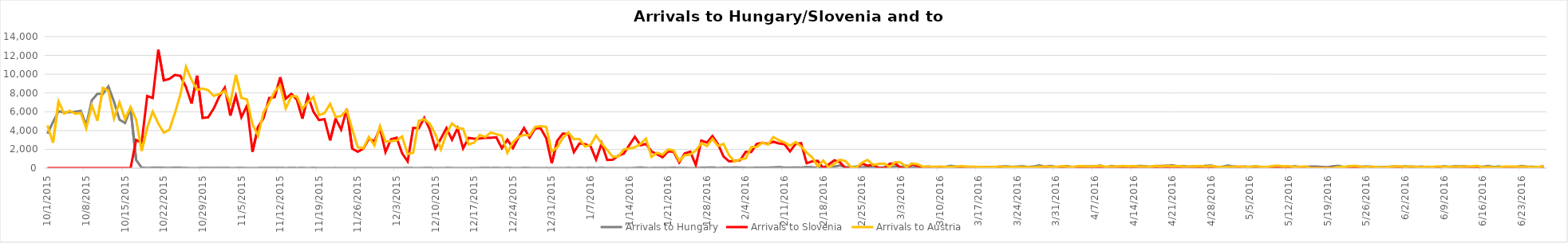
| Category | Arrivals to Hungary | Arrivals to Slovenia | Arrivals to Austria |
|---|---|---|---|
| 10/1/15 | 3667 | 0 | 4550 |
| 10/2/15 | 4897 | 0 | 2700 |
| 10/3/15 | 6056 | 0 | 7100 |
| 10/4/15 | 5925 | 0 | 5800 |
| 10/5/15 | 5952 | 0 | 6100 |
| 10/6/15 | 6000 | 0 | 5800 |
| 10/7/15 | 6103 | 0 | 5861 |
| 10/8/15 | 4583 | 6 | 4229 |
| 10/9/15 | 7215 | 0 | 6700 |
| 10/10/15 | 7907 | 0 | 5050 |
| 10/11/15 | 7897 | 0 | 8540 |
| 10/12/15 | 8702 | 0 | 8240 |
| 10/13/15 | 7081 | 0 | 5280 |
| 10/14/15 | 5157 | 0 | 7000 |
| 10/15/15 | 4808 | 0 | 5235 |
| 10/16/15 | 6353 | 0 | 6500 |
| 10/17/15 | 870 | 3000 | 5155 |
| 10/18/15 | 41 | 2700 | 1822 |
| 10/19/15 | 22 | 7677 | 4300 |
| 10/20/15 | 36 | 7478 | 6017 |
| 10/21/15 | 39 | 12616 | 4737 |
| 10/22/15 | 32 | 9339 | 3767 |
| 10/23/15 | 29 | 9500 | 4092 |
| 10/24/15 | 35 | 9925 | 5841 |
| 10/25/15 | 34 | 9818 | 7882 |
| 10/26/15 | 12 | 8625 | 10784 |
| 10/27/15 | 7 | 6877 | 9390 |
| 10/28/15 | 4 | 9848 | 8336 |
| 10/29/15 | 23 | 5341 | 8473 |
| 10/30/15 | 18 | 5409 | 8302 |
| 10/31/15 | 10 | 6344 | 7691 |
| 11/1/15 | 14 | 7611 | 7887 |
| 11/2/15 | 31 | 8568 | 8243 |
| 11/3/15 | 8 | 5591 | 6900 |
| 11/4/15 | 10 | 7693 | 9930 |
| 11/5/15 | 18 | 5426 | 7478 |
| 11/6/15 | 4 | 6655 | 7315 |
| 11/7/15 | 8 | 1716 | 4648 |
| 11/8/15 | 9 | 4381 | 3465 |
| 11/9/15 | 25 | 5341 | 5962 |
| 11/10/15 | 14 | 7457 | 6933 |
| 11/11/15 | 13 | 7554 | 8169 |
| 11/12/15 | 23 | 9681 | 8777 |
| 11/13/15 | 6 | 7397 | 6351 |
| 11/14/15 | 21 | 7905 | 7659 |
| 11/15/15 | 8 | 7300 | 7632 |
| 11/16/15 | 15 | 5261 | 6319 |
| 11/17/15 | 5 | 7704 | 7026 |
| 11/18/15 | 15 | 5998 | 7577 |
| 11/19/15 | 4 | 5119 | 5635 |
| 11/20/15 | 9 | 5211 | 5865 |
| 11/21/15 | 2 | 2952 | 6836 |
| 11/22/15 | 11 | 5260 | 5446 |
| 11/23/15 | 4 | 4102 | 5546 |
| 11/24/15 | 4 | 6297 | 6204 |
| 11/25/15 | 6 | 2070 | 4122 |
| 11/26/15 | 10 | 1742 | 2211 |
| 11/27/15 | 2 | 2065 | 2120 |
| 11/28/15 | 6 | 3139 | 3320 |
| 11/29/15 | 3 | 2843 | 2407 |
| 11/30/15 | 7 | 4274 | 4482 |
| 12/1/15 | 4 | 1709 | 2821 |
| 12/2/15 | 4 | 3077 | 2874 |
| 12/3/15 | 9 | 3237 | 2935 |
| 12/4/15 | 1 | 1577 | 3366 |
| 12/5/15 | 31 | 715 | 1493 |
| 12/6/15 | 7 | 4288 | 1643 |
| 12/7/15 | 0 | 4240 | 5035 |
| 12/8/15 | 13 | 5351 | 5210 |
| 12/9/15 | 14 | 4103 | 4714 |
| 12/10/15 | 3 | 2078 | 3623 |
| 12/11/15 | 0 | 3149 | 2000 |
| 12/12/15 | 13 | 4271 | 3675 |
| 12/13/15 | 10 | 3016 | 4754 |
| 12/14/15 | 3 | 4250 | 4263 |
| 12/15/15 | 2 | 2098 | 4193 |
| 12/16/15 | 6 | 3214 | 2519 |
| 12/17/15 | 0 | 3135 | 2717 |
| 12/18/15 | 11 | 3150 | 3532 |
| 12/19/15 | 31 | 3222 | 3305 |
| 12/20/15 | 8 | 3233 | 3800 |
| 12/21/15 | 25 | 3278 | 3611 |
| 12/22/15 | 1 | 2118 | 3451 |
| 12/23/15 | 21 | 3030 | 1613 |
| 12/24/15 | 8 | 2131 | 2764 |
| 12/25/15 | 2 | 3257 | 3321 |
| 12/26/15 | 17 | 4274 | 3532 |
| 12/27/15 | 10 | 3253 | 3476 |
| 12/28/15 | 0 | 4228 | 4394 |
| 12/29/15 | 0 | 4239 | 4468 |
| 12/30/15 | 11 | 3195 | 4386 |
| 12/31/15 | 5 | 511 | 1756 |
| 1/1/16 | 0 | 2914 | 2226 |
| 1/2/16 | 0 | 3690 | 3199 |
| 1/3/16 | 17 | 3619 | 3793 |
| 1/4/16 | 3 | 1708 | 3085 |
| 1/5/16 | 18 | 2626 | 3091 |
| 1/6/16 | 5 | 2550 | 2299 |
| 1/7/16 | 31 | 2337 | 2466 |
| 1/8/16 | 7 | 916 | 3472 |
| 1/9/16 | 15 | 2630 | 2619 |
| 1/10/16 | 6 | 880 | 1934 |
| 1/11/16 | 7 | 897 | 1204 |
| 1/12/16 | 2 | 1308 | 1231 |
| 1/13/16 | 5 | 1544 | 1991 |
| 1/14/16 | 4 | 2449 | 2082 |
| 1/15/16 | 14 | 3330 | 2219 |
| 1/16/16 | 65 | 2435 | 2578 |
| 1/17/16 | 11 | 2570 | 3141 |
| 1/18/16 | 9 | 1783 | 1203 |
| 1/19/16 | 29 | 1476 | 1630 |
| 1/20/16 | 10 | 1154 | 1439 |
| 1/21/16 | 13 | 1787 | 1989 |
| 1/22/16 | 47 | 1738 | 1885 |
| 1/23/16 | 10 | 606 | 777 |
| 1/24/16 | 15 | 1564 | 1366 |
| 1/25/16 | 5 | 1746 | 1450 |
| 1/26/16 | 4 | 326 | 1867 |
| 1/27/16 | 36 | 2935 | 2670 |
| 1/28/16 | 51 | 2719 | 2340 |
| 1/29/16 | 69 | 3416 | 3121 |
| 1/30/16 | 6 | 2556 | 2351 |
| 1/31/16 | 39 | 1249 | 2579 |
| 2/1/16 | 31 | 716 | 1367 |
| 2/2/16 | 69 | 765 | 690 |
| 2/3/16 | 46 | 841 | 937 |
| 2/4/16 | 31 | 1733 | 1026 |
| 2/5/16 | 19 | 1713 | 2235 |
| 2/6/16 | 49 | 2580 | 2252 |
| 2/7/16 | 53 | 2694 | 2737 |
| 2/8/16 | 48 | 2582 | 2490 |
| 2/9/16 | 72 | 2805 | 3314 |
| 2/10/16 | 104 | 2637 | 2968 |
| 2/11/16 | 54 | 2547 | 2731 |
| 2/12/16 | 39 | 1774 | 2378 |
| 2/13/16 | 66 | 2576 | 2781 |
| 2/14/16 | 51 | 2660 | 2301 |
| 2/15/16 | 119 | 516 | 1651 |
| 2/16/16 | 93 | 715 | 1143 |
| 2/17/16 | 34 | 769 | 181 |
| 2/18/16 | 73 | 0 | 817 |
| 2/19/16 | 113 | 407 | 50 |
| 2/20/16 | 151 | 828 | 453 |
| 2/21/16 | 288 | 623 | 899 |
| 2/22/16 | 103 | 0 | 744 |
| 2/23/16 | 112 | 0 | 111 |
| 2/24/16 | 166 | 0 | 75 |
| 2/25/16 | 76 | 478 | 583 |
| 2/26/16 | 140 | 254 | 874 |
| 2/27/16 | 111 | 382 | 321 |
| 2/28/16 | 62 | 0 | 447 |
| 2/29/16 | 78 | 0 | 487 |
| 3/1/16 | 83 | 466 | 118 |
| 3/2/16 | 181 | 479 | 644 |
| 3/3/16 | 133 | 0 | 588 |
| 3/4/16 | 268 | 0 | 114 |
| 3/5/16 | 89 | 409 | 500 |
| 3/6/16 | 72 | 253 | 402 |
| 3/7/16 | 100 | 0 | 153 |
| 3/8/16 | 167 | 0 | 171 |
| 3/9/16 | 73 | 0 | 134 |
| 3/10/16 | 70 | 0 | 172 |
| 3/11/16 | 133 | 0 | 132 |
| 3/12/16 | 245 | 0 | 116 |
| 3/13/16 | 148 | 0 | 171 |
| 3/14/16 | 123 | 0 | 211 |
| 3/15/16 | 153 | 0 | 147 |
| 3/16/16 | 104 | 0 | 150 |
| 3/17/16 | 102 | 0 | 129 |
| 3/18/16 | 95 | 0 | 107 |
| 3/19/16 | 132 | 0 | 109 |
| 3/20/16 | 107 | 0 | 126 |
| 3/21/16 | 176 | 0 | 177 |
| 3/22/16 | 188 | 0 | 103 |
| 3/23/16 | 137 | 0 | 127 |
| 3/24/16 | 171 | 0 | 121 |
| 3/25/16 | 199 | 0 | 94 |
| 3/26/16 | 125 | 0 | 104 |
| 3/27/16 | 171 | 6 | 78 |
| 3/28/16 | 293 | 0 | 144 |
| 3/29/16 | 154 | 5 | 170 |
| 3/30/16 | 234 | 4 | 152 |
| 3/31/16 | 127 | 0 | 120 |
| 4/1/16 | 142 | 0 | 210 |
| 4/2/16 | 217 | 0 | 156 |
| 4/3/16 | 119 | 0 | 122 |
| 4/4/16 | 99 | 0 | 221 |
| 4/5/16 | 176 | 2 | 203 |
| 4/6/16 | 191 | 0 | 198 |
| 4/7/16 | 178 | 0 | 196 |
| 4/8/16 | 280 | 0 | 254 |
| 4/9/16 | 83 | 0 | 138 |
| 4/10/16 | 230 | 0 | 171 |
| 4/11/16 | 149 | 0 | 171 |
| 4/12/16 | 214 | 0 | 232 |
| 4/13/16 | 150 | 0 | 193 |
| 4/14/16 | 161 | 0 | 209 |
| 4/15/16 | 237 | 0 | 176 |
| 4/16/16 | 210 | 0 | 175 |
| 4/17/16 | 144 | 0 | 148 |
| 4/18/16 | 229 | 0 | 231 |
| 4/19/16 | 235 | 0 | 183 |
| 4/20/16 | 274 | 0 | 268 |
| 4/21/16 | 294 | 0 | 195 |
| 4/22/16 | 195 | 0 | 227 |
| 4/23/16 | 226 | 0 | 174 |
| 4/24/16 | 151 | 0 | 175 |
| 4/25/16 | 202 | 0 | 191 |
| 4/26/16 | 190 | 0 | 230 |
| 4/27/16 | 241 | 0 | 172 |
| 4/28/16 | 284 | 0 | 232 |
| 4/29/16 | 108 | 0 | 151 |
| 4/30/16 | 141 | 0 | 102 |
| 5/1/16 | 274 | 0 | 136 |
| 5/2/16 | 187 | 0 | 150 |
| 5/3/16 | 131 | 0 | 173 |
| 5/4/16 | 169 | 0 | 141 |
| 5/5/16 | 133 | 0 | 128 |
| 5/6/16 | 178 | 0 | 201 |
| 5/7/16 | 132 | 0 | 129 |
| 5/8/16 | 75 | 0 | 121 |
| 5/9/16 | 124 | 0 | 218 |
| 5/10/16 | 128 | 0 | 260 |
| 5/11/16 | 120 | 0 | 191 |
| 5/12/16 | 89 | 0 | 210 |
| 5/13/16 | 201 | 0 | 120 |
| 5/14/16 | 120 | 0 | 150 |
| 5/15/16 | 139 | 0 | 169 |
| 5/16/16 | 169 | 0 | 0 |
| 5/17/16 | 164 | 0 | 0 |
| 5/18/16 | 121 | 0 | 0 |
| 5/19/16 | 100 | 0 | 0 |
| 5/20/16 | 198 | 0 | 0 |
| 5/21/16 | 245 | 0 | 138 |
| 5/22/16 | 108 | 0 | 122 |
| 5/23/16 | 193 | 0 | 210 |
| 5/24/16 | 198 | 0 | 245 |
| 5/25/16 | 139 | 0 | 156 |
| 5/26/16 | 181 | 0 | 107 |
| 5/27/16 | 144 | 0 | 170 |
| 5/28/16 | 92 | 0 | 79 |
| 5/29/16 | 115 | 0 | 77 |
| 5/30/16 | 140 | 0 | 122 |
| 5/31/16 | 182 | 0 | 177 |
| 6/1/16 | 138 | 0 | 196 |
| 6/2/16 | 187 | 0 | 132 |
| 6/3/16 | 146 | 0 | 167 |
| 6/4/16 | 135 | 0 | 135 |
| 6/5/16 | 164 | 0 | 107 |
| 6/6/16 | 100 | 0 | 140 |
| 6/7/16 | 131 | 0 | 132 |
| 6/8/16 | 104 | 0 | 185 |
| 6/9/16 | 201 | 0 | 122 |
| 6/10/16 | 129 | 0 | 141 |
| 6/11/16 | 219 | 0 | 165 |
| 6/12/16 | 181 | 0 | 152 |
| 6/13/16 | 189 | 0 | 171 |
| 6/14/16 | 95 | 0 | 184 |
| 6/15/16 | 155 | 0 | 235 |
| 6/16/16 | 147 | 0 | 96 |
| 6/17/16 | 230 | 0 | 139 |
| 6/18/16 | 114 | 0 | 66 |
| 6/19/16 | 185 | 0 | 109 |
| 6/20/16 | 47 | 0 | 167 |
| 6/21/16 | 52 | 0 | 179 |
| 6/22/16 | 125 | 0 | 151 |
| 6/23/16 | 223 | 0 | 142 |
| 6/24/16 | 159 | 0 | 149 |
| 6/25/16 | 159 | 0 | 95 |
| 6/26/16 | 75 | 0 | 101 |
| 6/27/16 | 238 | 0 | 201 |